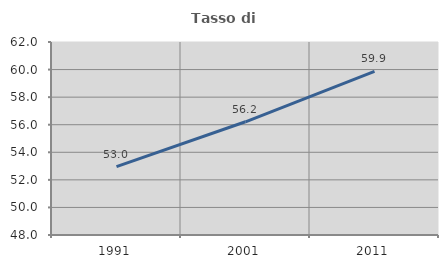
| Category | Tasso di occupazione   |
|---|---|
| 1991.0 | 52.954 |
| 2001.0 | 56.212 |
| 2011.0 | 59.863 |